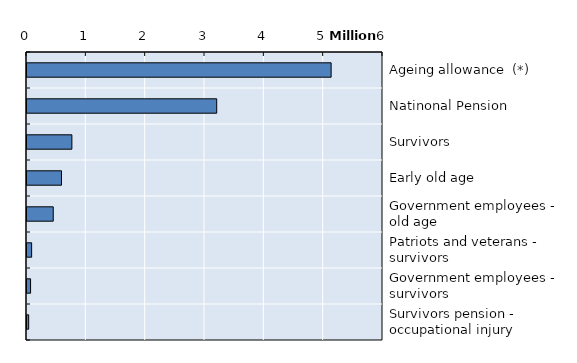
| Category | Series 0 |
|---|---|
| Ageing allowance  (*) | 5125731 |
| Natinonal Pension  | 3197486 |
| Survivors | 756425 |
| Early old age | 581338 |
| Government employees - old age | 442241 |
| Patriots and veterans - survivors | 78130 |
| Government employees - survivors | 60266 |
| Survivors pension - occupational injury | 28237 |